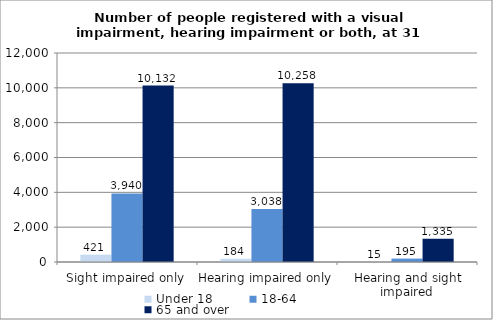
| Category | Under 18 | 18-64 | 65 and over |
|---|---|---|---|
| Sight impaired only | 421 | 3940 | 10132 |
| Hearing impaired only | 184 | 3038 | 10258 |
| Hearing and sight impaired | 15 | 195 | 1335 |